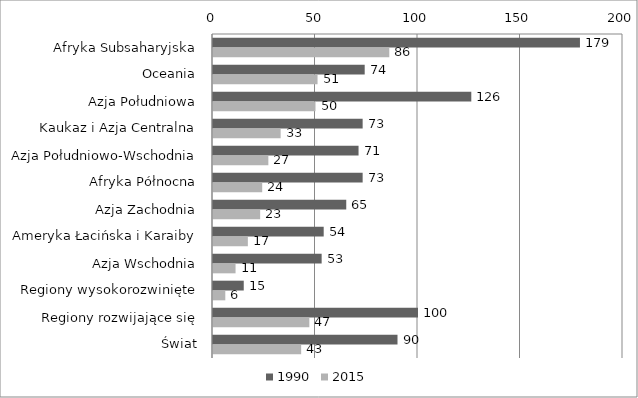
| Category | 1990 | 2015 |
|---|---|---|
| Afryka Subsaharyjska | 179 | 86 |
| Oceania | 74 | 51 |
| Azja Południowa | 126 | 50 |
| Kaukaz i Azja Centralna | 73 | 33 |
| Azja Południowo-Wschodnia | 71 | 27 |
| Afryka Północna | 73 | 24 |
| Azja Zachodnia | 65 | 23 |
| Ameryka Łacińska i Karaiby | 54 | 17 |
| Azja Wschodnia | 53 | 11 |
| Regiony wysokorozwinięte | 15 | 6 |
| Regiony rozwijające się | 100 | 47 |
| Świat | 90 | 43 |